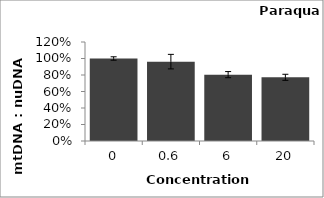
| Category | Series 1 |
|---|---|
| 0.0 | 1 |
| 0.6 | 0.962 |
| 6.0 | 0.804 |
| 20.0 | 0.772 |